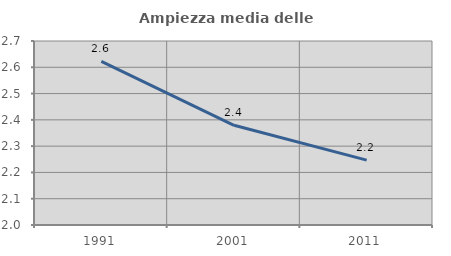
| Category | Ampiezza media delle famiglie |
|---|---|
| 1991.0 | 2.622 |
| 2001.0 | 2.379 |
| 2011.0 | 2.247 |